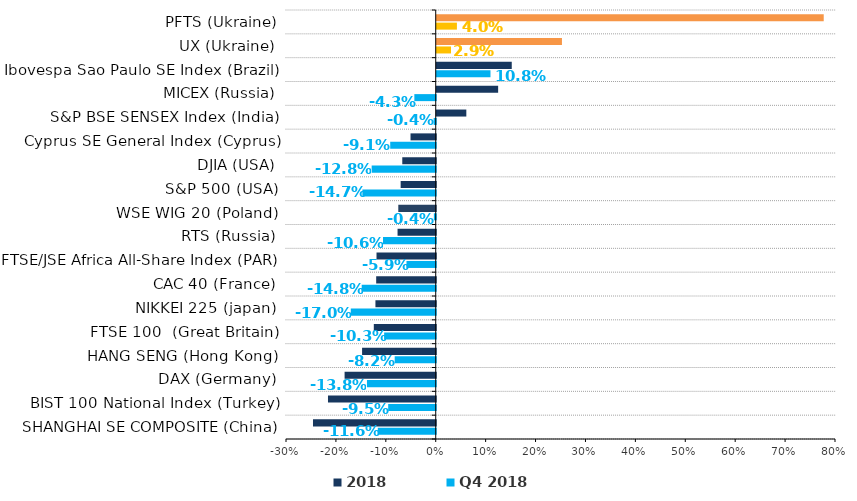
| Category | Q4 2018 | 2018 |
|---|---|---|
| SHANGHAI SE COMPOSITE (China) | -0.116 | -0.246 |
| BIST 100 National Index (Тurkey) | -0.095 | -0.216 |
| DAX (Germany) | -0.138 | -0.183 |
| HANG SENG (Hong Kong) | -0.082 | -0.148 |
| FTSE 100  (Great Britain) | -0.103 | -0.124 |
| NIKKEI 225 (japan) | -0.17 | -0.121 |
| CAC 40 (France) | -0.148 | -0.119 |
| FTSE/JSE Africa All-Share Index (PAR) | -0.059 | -0.119 |
| RTS (Russia) | -0.106 | -0.076 |
| WSE WIG 20 (Poland) | -0.004 | -0.075 |
| S&P 500 (USA) | -0.147 | -0.07 |
| DJIA (USA) | -0.128 | -0.067 |
| Cyprus SE General Index (Cyprus) | -0.091 | -0.051 |
| S&P BSE SENSEX Index (Іndia) | -0.004 | 0.059 |
| MICEX (Russia) | -0.043 | 0.123 |
| Ibovespa Sao Paulo SE Index (Brazil) | 0.108 | 0.15 |
| UX (Ukraine) | 0.029 | 0.251 |
| PFTS (Ukraine) | 0.04 | 0.775 |